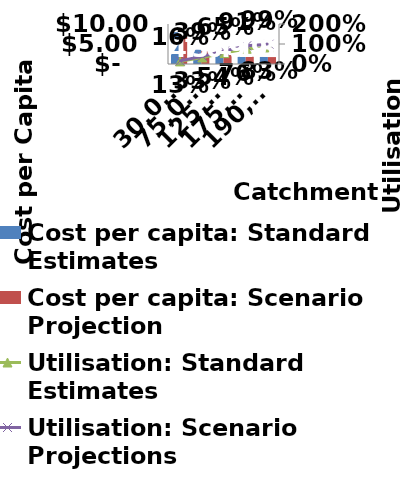
| Category | Cost per capita: Standard Estimates | Cost per capita: Scenario Projection |
|---|---|---|
| 30000.0 | 7.969 | 6.936 |
| 75000.0 | 3.57 | 3.228 |
| 125000.0 | 2.397 | 2.239 |
| 175000.0 | 1.894 | 1.815 |
| 190000.0 | 1.795 | 1.731 |